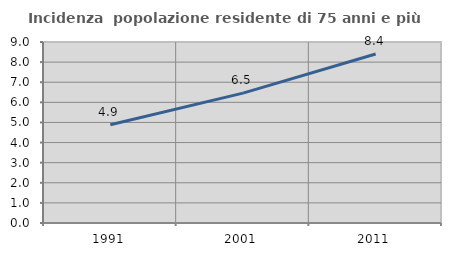
| Category | Incidenza  popolazione residente di 75 anni e più |
|---|---|
| 1991.0 | 4.882 |
| 2001.0 | 6.458 |
| 2011.0 | 8.405 |